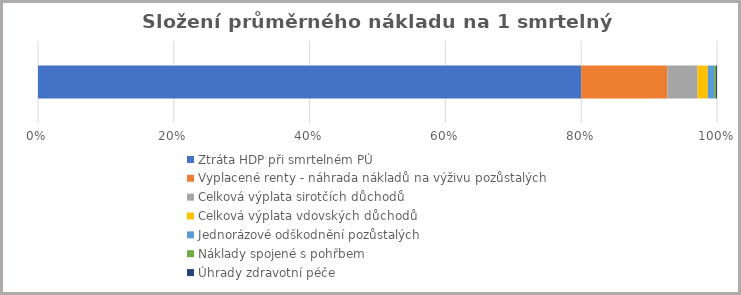
| Category | Ztráta HDP při smrtelném PÚ | Vyplacené renty - náhrada nákladů na výživu pozůstalých | Celková výplata sirotčích důchodů | Celková výplata vdovských důchodů | Jednorázové odškodnění pozůstalých | Náklady spojené s pohřbem | Úhrady zdravotní péče |
|---|---|---|---|---|---|---|---|
| Hodnota | 20390603.568 | 3237238.27 | 1131433.983 | 385376.867 | 235788.618 | 67983.74 | 41199.529 |